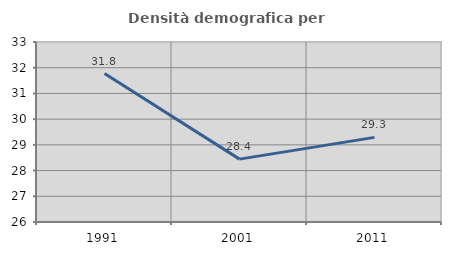
| Category | Densità demografica |
|---|---|
| 1991.0 | 31.775 |
| 2001.0 | 28.445 |
| 2011.0 | 29.291 |